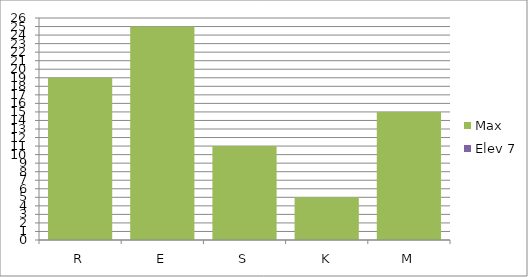
| Category | Max | Elev 7 |
|---|---|---|
| R | 19 | 0 |
| E | 25 | 0 |
| S | 11 | 0 |
| K | 5 | 0 |
| M | 15 | 0 |